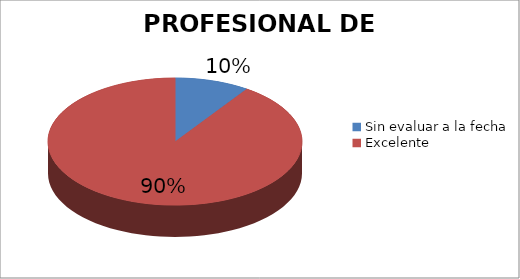
| Category | Cantidad |
|---|---|
| Sin evaluar a la fecha | 2 |
| Excelente | 19 |